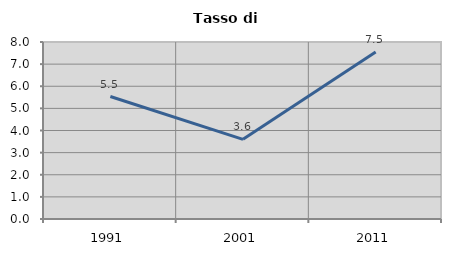
| Category | Tasso di disoccupazione   |
|---|---|
| 1991.0 | 5.535 |
| 2001.0 | 3.601 |
| 2011.0 | 7.55 |